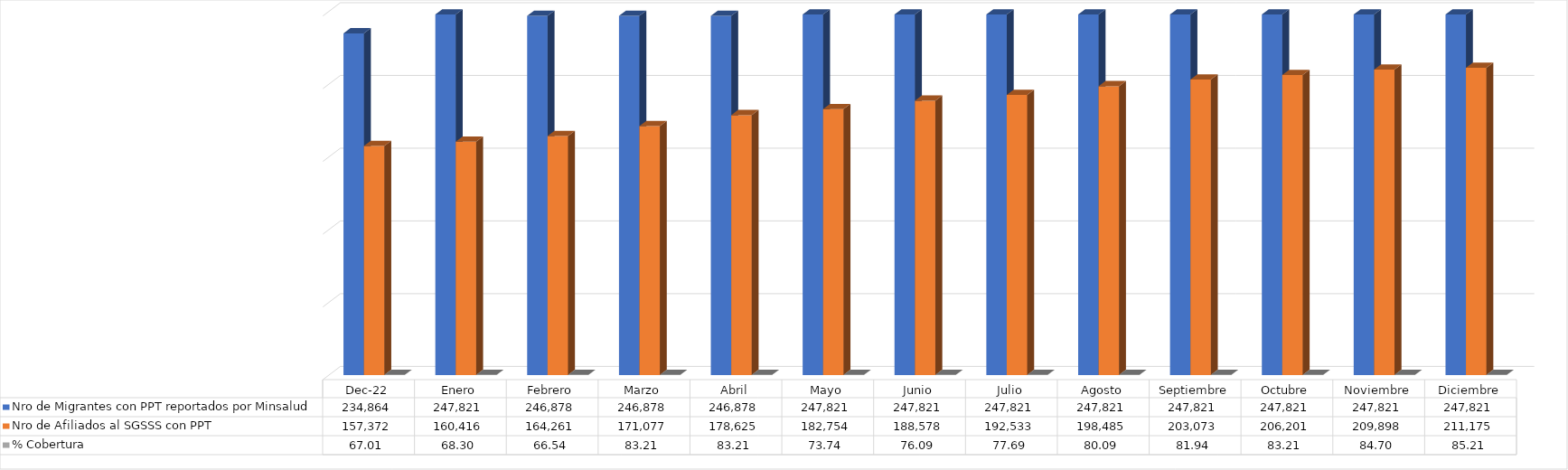
| Category | Nro de Migrantes con PPT reportados por Minsalud  | Nro de Afiliados al SGSSS con PPT | % Cobertura |
|---|---|---|---|
| dic-22 | 234864 | 157372 | 67.006 |
| Enero | 247821 | 160416 | 68.302 |
| Febrero | 246878 | 164261 | 66.535 |
| Marzo | 246878 | 171077 | 83.206 |
| Abril | 246878 | 178625 | 83.206 |
| Mayo | 247821 | 182754 | 73.744 |
| Junio | 247821 | 188578 | 76.094 |
| Julio | 247821 | 192533 | 77.69 |
| Agosto | 247821 | 198485 | 80.092 |
| Septiembre | 247821 | 203073 | 81.943 |
| Octubre | 247821 | 206201 | 83.206 |
| Noviembre | 247821 | 209898 | 84.697 |
| Diciembre | 247821 | 211175 | 85.213 |